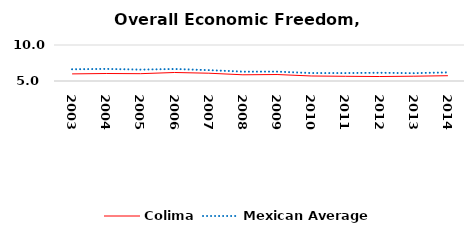
| Category | Colima | Mexican Average  |
|---|---|---|
| 2003.0 | 5.986 | 6.632 |
| 2004.0 | 6.04 | 6.678 |
| 2005.0 | 6.017 | 6.582 |
| 2006.0 | 6.182 | 6.668 |
| 2007.0 | 6.081 | 6.508 |
| 2008.0 | 5.863 | 6.3 |
| 2009.0 | 5.899 | 6.3 |
| 2010.0 | 5.696 | 6.105 |
| 2011.0 | 5.655 | 6.103 |
| 2012.0 | 5.623 | 6.144 |
| 2013.0 | 5.666 | 6.087 |
| 2014.0 | 5.734 | 6.195 |